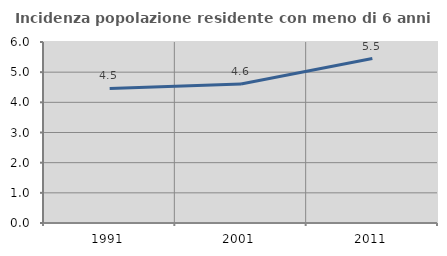
| Category | Incidenza popolazione residente con meno di 6 anni |
|---|---|
| 1991.0 | 4.461 |
| 2001.0 | 4.61 |
| 2011.0 | 5.45 |